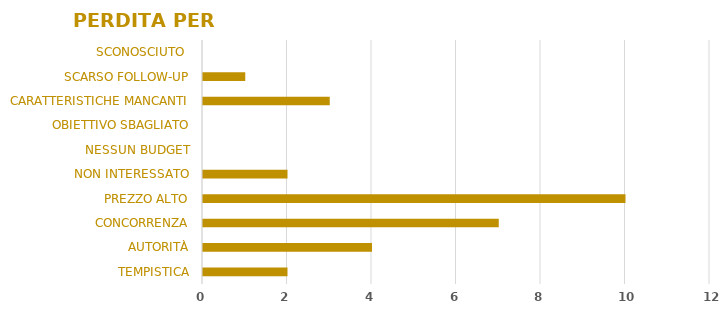
| Category | Series 0 |
|---|---|
| TEMPISTICA | 2 |
| AUTORITÀ | 4 |
| CONCORRENZA | 7 |
| PREZZO ALTO | 10 |
| NON INTERESSATO | 2 |
| NESSUN BUDGET | 0 |
| OBIETTIVO SBAGLIATO | 0 |
| CARATTERISTICHE MANCANTI | 3 |
| SCARSO FOLLOW-UP | 1 |
| SCONOSCIUTO  | 0 |